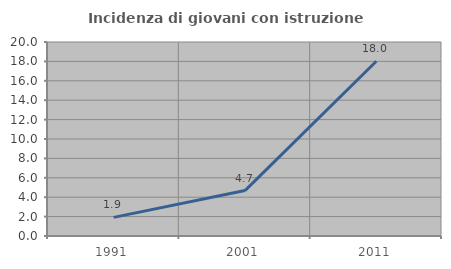
| Category | Incidenza di giovani con istruzione universitaria |
|---|---|
| 1991.0 | 1.918 |
| 2001.0 | 4.683 |
| 2011.0 | 18.021 |